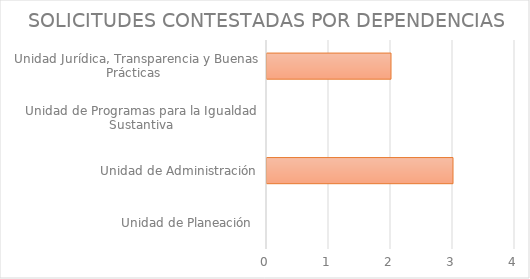
| Category | Series 1 |
|---|---|
| Unidad de Planeación  | 0 |
| Unidad de Administración | 3 |
| Unidad de Programas para la Igualdad Sustantiva | 0 |
| Unidad Jurídica, Transparencia y Buenas Prácticas  | 2 |